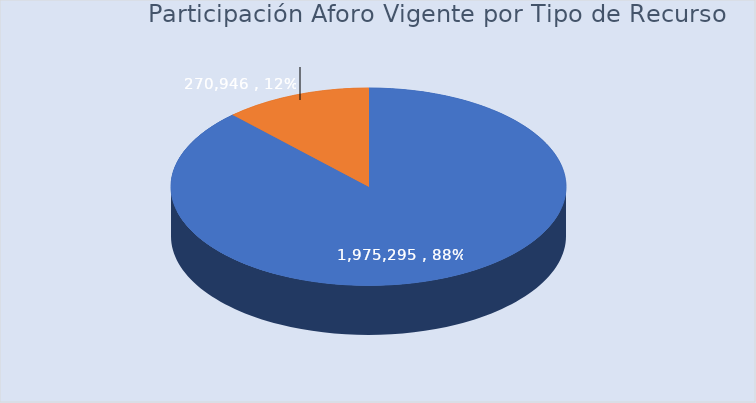
| Category | Total |
|---|---|
| Nación | 1975294.901 |
| Propios | 270945.743 |